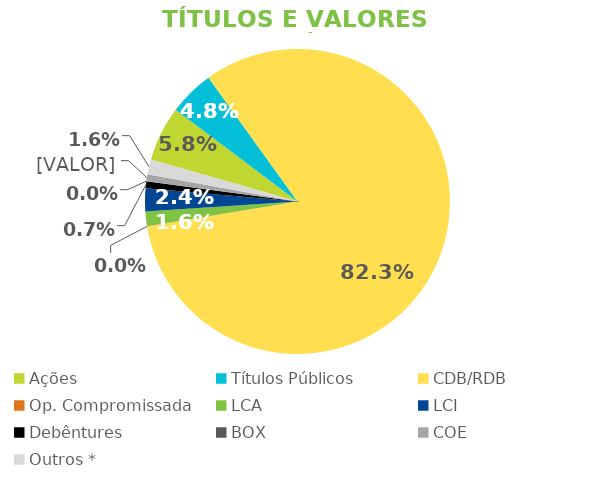
| Category | TVM |
|---|---|
| Ações | 0.058 |
| Títulos Públicos | 0.048 |
| CDB/RDB | 0.823 |
| Op. Compromissada | 0 |
| LCA | 0.016 |
| LCI | 0.024 |
| Debêntures | 0.007 |
| BOX | 0 |
| COE | 0.007 |
| Outros * | 0.016 |